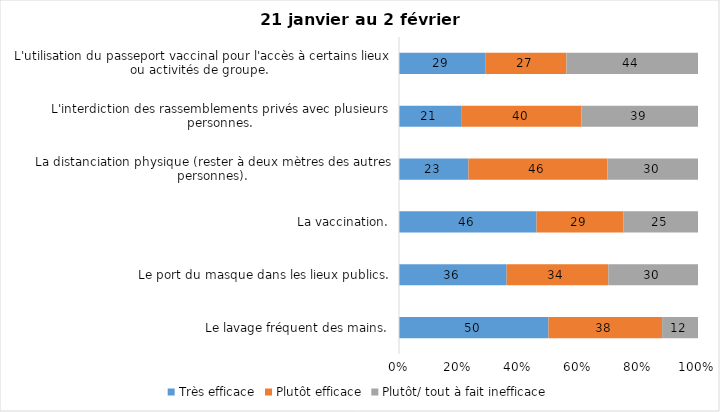
| Category | Très efficace | Plutôt efficace | Plutôt/ tout à fait inefficace |
|---|---|---|---|
| Le lavage fréquent des mains. | 50 | 38 | 12 |
| Le port du masque dans les lieux publics. | 36 | 34 | 30 |
| La vaccination. | 46 | 29 | 25 |
| La distanciation physique (rester à deux mètres des autres personnes). | 23 | 46 | 30 |
| L'interdiction des rassemblements privés avec plusieurs personnes. | 21 | 40 | 39 |
| L'utilisation du passeport vaccinal pour l'accès à certains lieux ou activités de groupe.  | 29 | 27 | 44 |